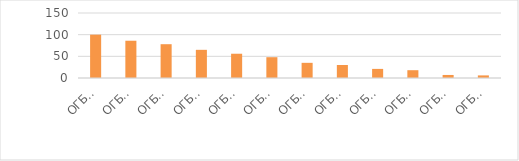
| Category | Series 0 |
|---|---|
| ОГБОУ СПО Ульяновский техникум железнодорожного транспорта | 100 |
| ОГБОУ СПО Ульяновский социально-педагогический колледж №1 | 86 |
| ОГБОУ СПО "Ульяновский строительный колледж" | 78 |
| ОГБОУ СПО «Ульяновский электромеханический колледж» | 65 |
| ОГБОУ СПО технологический техникум в р.п.Радищево | 56 |
| ОГБОУ СПОтехнологический техникум в р.п. Николаевка  | 48 |
| ОГБОУ СПО «Димитровградский техникум строительной индустрии» | 35 |
| ОГБОУ СПО «Димитровградский техникум профессиональных технологий имени Героя Советского Союза М.С.Чернова» | 30 |
| ОГБОУ СПО " Сурский агротехнологический техникум "  | 21 |
| ОГБОУ СПО технологический техникум р.п.Павловка | 18 |
| ОГБОУ СПО «Карсунский медицинский техникум» | 7 |
| ОГБОУ СПО «Димитровградский механико-технологический колледж молочной промышленности» | 6 |